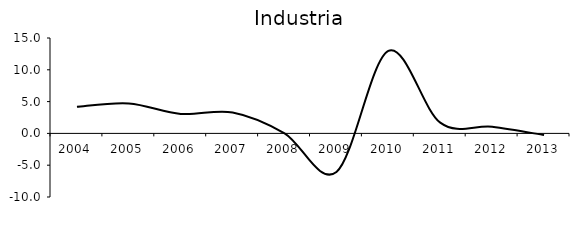
| Category | Industria |
|---|---|
| 2004.0 | 4.193 |
| 2005.0 | 4.715 |
| 2006.0 | 3.068 |
| 2007.0 | 3.291 |
| 2008.0 | 0.016 |
| 2009.0 | -6.065 |
| 2010.0 | 12.98 |
| 2011.0 | 1.691 |
| 2012.0 | 1.05 |
| 2013.0 | -0.267 |